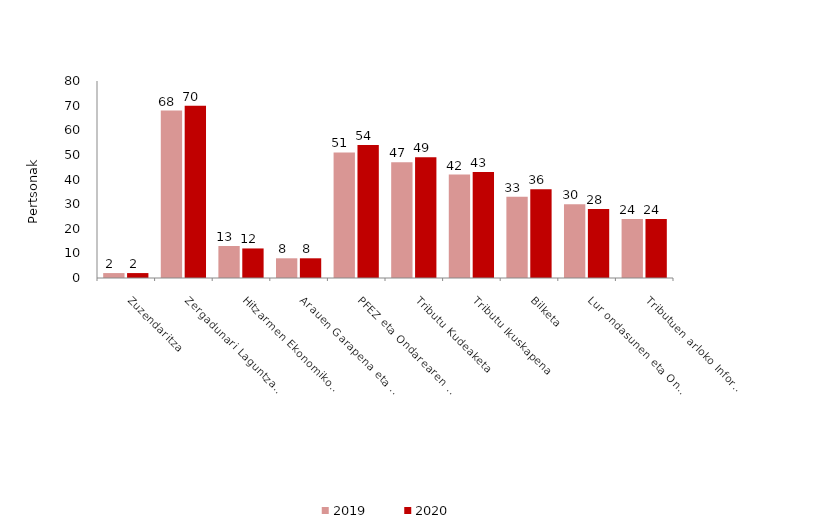
| Category | 2019 | 2020 |
|---|---|---|
| Zuzendaritza | 2 | 2 |
| Zergadunari Laguntza eta Argibideak Ematea | 68 | 70 |
| Hitzarmen Ekonomikoa eta Finantza Plangintza | 13 | 12 |
| Arauen Garapena eta Aholkularitza Juridikoa | 8 | 8 |
| PFEZ eta Ondarearen gaineko zerga kudeatzea | 51 | 54 |
| Tributu Kudeaketa | 47 | 49 |
| Tributu Ikuskapena | 42 | 43 |
| Bilketa | 33 | 36 |
| Lur ondasunen eta Ondarearen gaineko zergak | 30 | 28 |
| Tributuen arloko Informazio Sistemak | 24 | 24 |